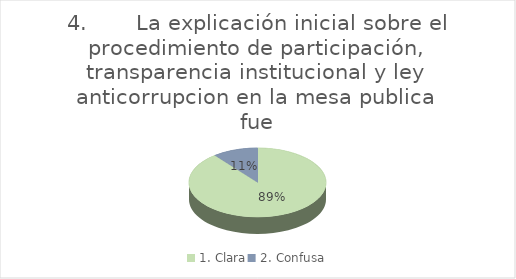
| Category | Series 0 |
|---|---|
| 1. Clara | 25 |
| 2. Confusa | 3 |